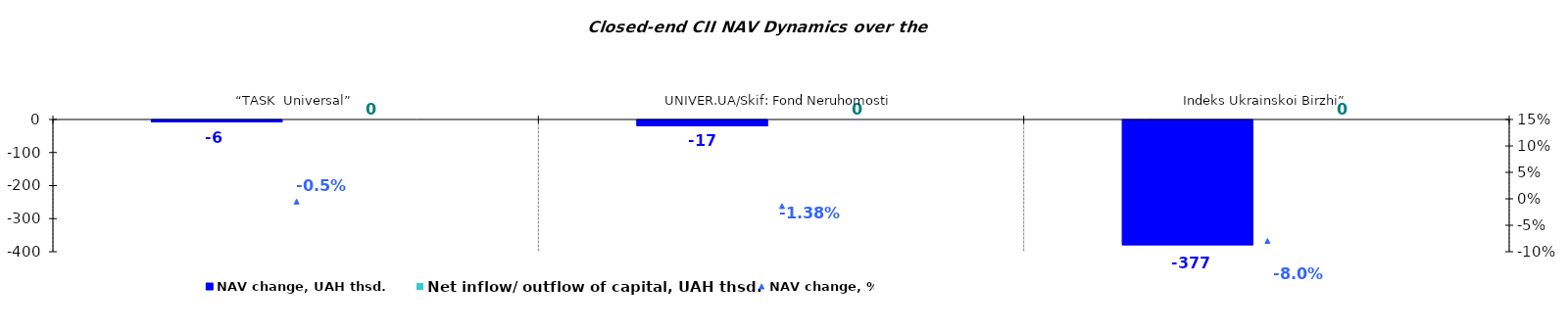
| Category | NAV change, UAH thsd. | Net inflow/ outflow of capital, UAH thsd. |
|---|---|---|
| “TASK  Universal” | -5.925 | 0 |
| UNIVER.UA/Skif: Fond Neruhomosti | -17.466 | 0 |
| Indeks Ukrainskoi Birzhi” | -377.419 | 0 |